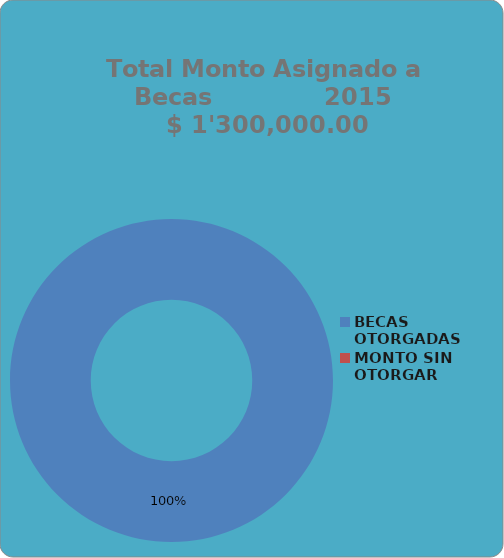
| Category | Series 0 |
|---|---|
| BECAS OTORGADAS | 1300000 |
| MONTO SIN OTORGAR | 0 |